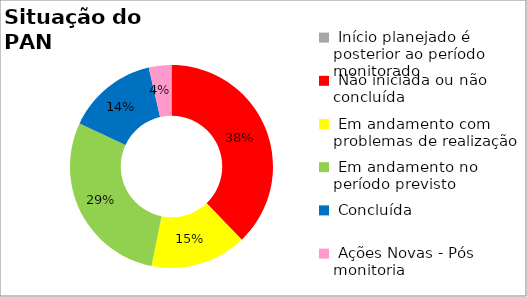
| Category | Series 0 |
|---|---|
|  Início planejado é posterior ao período monitorado | 0 |
|  Não iniciada ou não concluída | 0.378 |
|  Em andamento com problemas de realização | 0.153 |
|  Em andamento no período previsto  | 0.288 |
|  Concluída | 0.144 |
|  Ações Novas - Pós monitoria | 0.036 |